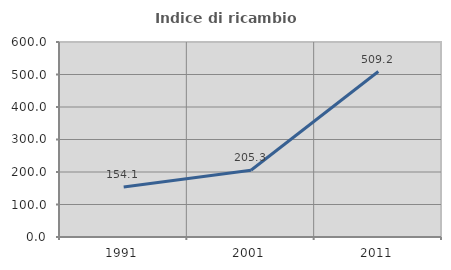
| Category | Indice di ricambio occupazionale  |
|---|---|
| 1991.0 | 154.054 |
| 2001.0 | 205.31 |
| 2011.0 | 509.16 |